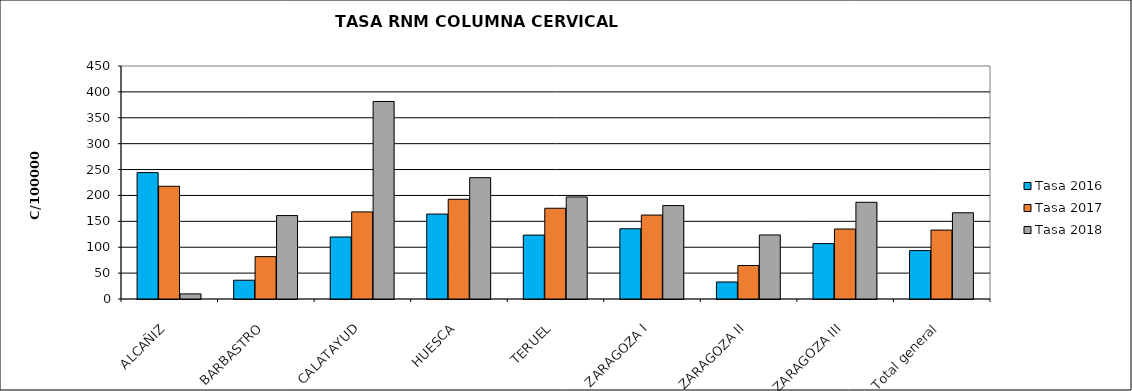
| Category | Tasa 2016 | Tasa 2017 | Tasa 2018 |
|---|---|---|---|
| ALCAÑIZ | 244.101 | 217.708 | 9.853 |
| BARBASTRO | 36.243 | 81.836 | 161.159 |
| CALATAYUD | 119.775 | 168.217 | 381.489 |
| HUESCA | 164.093 | 192.616 | 234.347 |
| TERUEL | 123.449 | 175.297 | 197.135 |
| ZARAGOZA I | 135.621 | 162.127 | 180.416 |
| ZARAGOZA II | 32.864 | 64.672 | 123.714 |
| ZARAGOZA III | 107.024 | 135.201 | 186.791 |
| Total general | 93.43 | 133.134 | 166.501 |